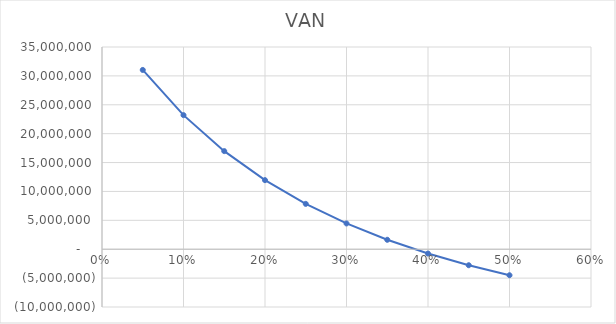
| Category | VAN |
|---|---|
| 0.05 | 31029930.319 |
| 0.1 | 23206511.647 |
| 0.15 | 16977562.679 |
| 0.2 | 11952323.581 |
| 0.25 | 7848810.367 |
| 0.3 | 4460400.809 |
| 0.35 | 1633545.453 |
| 0.4 | -747361.186 |
| 0.45 | -2770415.587 |
| 0.5 | -4503510.41 |